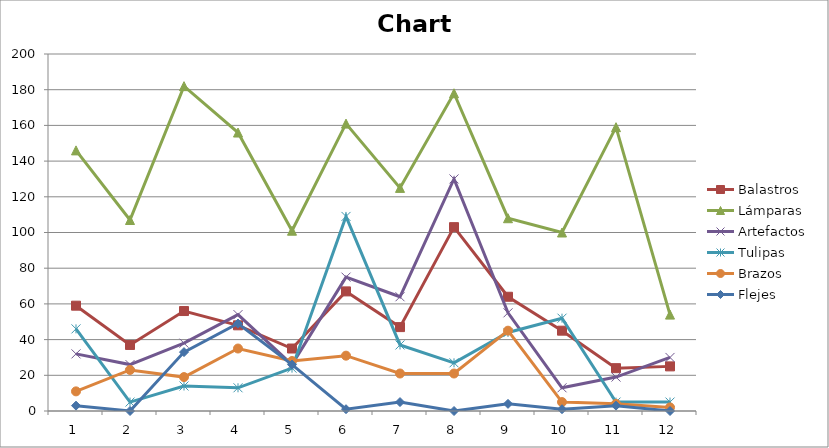
| Category | Balastros  | Lámparas  | Artefactos  | Tulipas  | Brazos  | Flejes  |
|---|---|---|---|---|---|---|
| 0 | 59 | 146 | 32 | 46 | 11 | 3 |
| 1 | 37 | 107 | 26 | 5 | 23 | 0 |
| 2 | 56 | 182 | 38 | 14 | 19 | 33 |
| 3 | 48 | 156 | 54 | 13 | 35 | 49 |
| 4 | 35 | 101 | 26 | 24 | 28 | 26 |
| 5 | 67 | 161 | 75 | 109 | 31 | 1 |
| 6 | 47 | 125 | 64 | 37 | 21 | 5 |
| 7 | 103 | 178 | 130 | 27 | 21 | 0 |
| 8 | 64 | 108 | 55 | 44 | 45 | 4 |
| 9 | 45 | 100 | 13 | 52 | 5 | 1 |
| 10 | 24 | 159 | 19 | 5 | 4 | 3 |
| 11 | 25 | 54 | 30 | 5 | 2 | 0 |